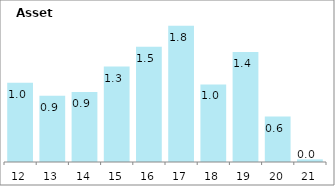
| Category | Series 0 |
|---|---|
| 2012-03-31 | 1.044 |
| 2013-03-31 | 0.872 |
| 2014-03-31 | 0.92 |
| 2015-03-31 | 1.255 |
| 2016-03-31 | 1.515 |
| 2017-03-31 | 1.794 |
| 2018-03-31 | 1.021 |
| 2019-03-31 | 1.447 |
| 2020-03-31 | 0.598 |
| 2021-03-31 | 0.035 |